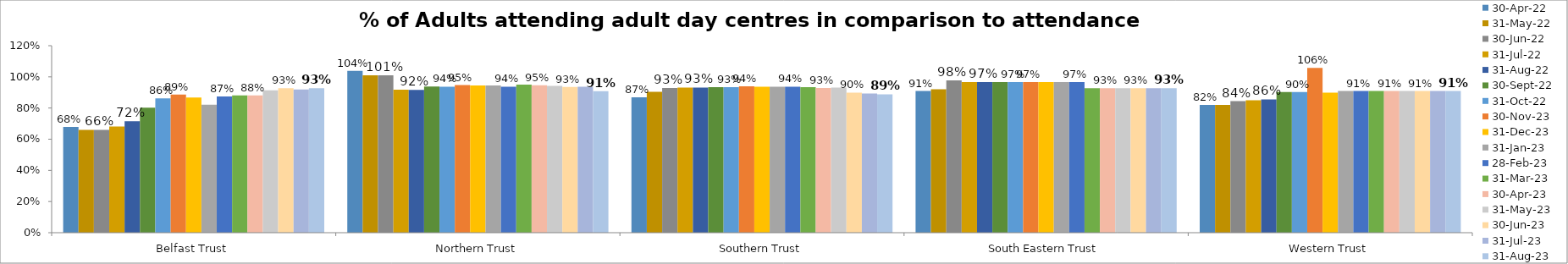
| Category | 30-Apr-22 | 31-May-22 | 30-Jun-22 | 31-Jul-22 | 31-Aug-22 | 30-Sep-22 | 31-Oct-22 | 30-Nov-23 | 31-Dec-23 | 31-Jan-23 | 28-Feb-23 | 31-Mar-23 | 30-Apr-23 | 31-May-23 | 30-Jun-23 | 31-Jul-23 | 31-Aug-23 |
|---|---|---|---|---|---|---|---|---|---|---|---|---|---|---|---|---|---|
| Belfast Trust | 0.679 | 0.66 | 0.66 | 0.682 | 0.716 | 0.803 | 0.862 | 0.886 | 0.867 | 0.821 | 0.874 | 0.881 | 0.881 | 0.913 | 0.927 | 0.918 | 0.927 |
| Northern Trust | 1.038 | 1.01 | 1.01 | 0.918 | 0.916 | 0.938 | 0.937 | 0.947 | 0.945 | 0.945 | 0.937 | 0.95 | 0.946 | 0.942 | 0.935 | 0.936 | 0.908 |
| Southern Trust | 0.869 | 0.904 | 0.929 | 0.932 | 0.932 | 0.934 | 0.934 | 0.94 | 0.937 | 0.937 | 0.937 | 0.934 | 0.929 | 0.932 | 0.899 | 0.893 | 0.888 |
| South Eastern Trust | 0.909 | 0.92 | 0.978 | 0.967 | 0.967 | 0.967 | 0.967 | 0.967 | 0.967 | 0.967 | 0.967 | 0.928 | 0.928 | 0.928 | 0.928 | 0.928 | 0.928 |
| Western Trust | 0.82 | 0.82 | 0.844 | 0.85 | 0.856 | 0.903 | 0.903 | 1.057 | 0.899 | 0.909 | 0.909 | 0.909 | 0.909 | 0.909 | 0.909 | 0.909 | 0.909 |